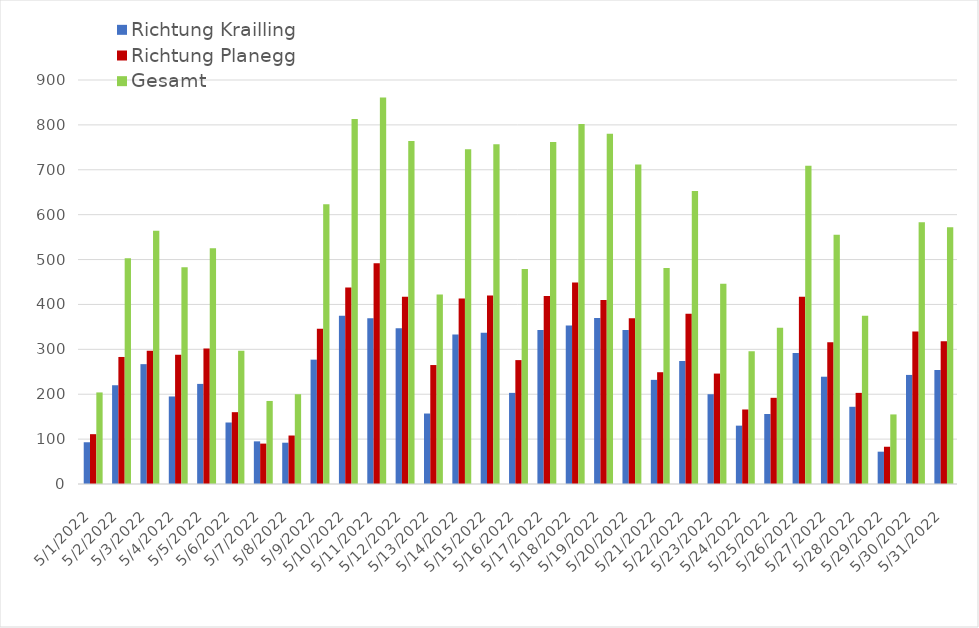
| Category | Richtung Krailling | Richtung Planegg | Gesamt |
|---|---|---|---|
| 5/1/22 | 93 | 111 | 204 |
| 5/2/22 | 220 | 283 | 503 |
| 5/3/22 | 267 | 297 | 564 |
| 5/4/22 | 195 | 288 | 483 |
| 5/5/22 | 223 | 302 | 525 |
| 5/6/22 | 137 | 160 | 297 |
| 5/7/22 | 95 | 90 | 185 |
| 5/8/22 | 92 | 108 | 200 |
| 5/9/22 | 277 | 346 | 623 |
| 5/10/22 | 375 | 438 | 813 |
| 5/11/22 | 369 | 492 | 861 |
| 5/12/22 | 347 | 417 | 764 |
| 5/13/22 | 157 | 265 | 422 |
| 5/14/22 | 333 | 413 | 746 |
| 5/15/22 | 337 | 420 | 757 |
| 5/16/22 | 203 | 276 | 479 |
| 5/17/22 | 343 | 419 | 762 |
| 5/18/22 | 353 | 449 | 802 |
| 5/19/22 | 370 | 410 | 780 |
| 5/20/22 | 343 | 369 | 712 |
| 5/21/22 | 232 | 249 | 481 |
| 5/22/22 | 274 | 379 | 653 |
| 5/23/22 | 200 | 246 | 446 |
| 5/24/22 | 130 | 166 | 296 |
| 5/25/22 | 156 | 192 | 348 |
| 5/26/22 | 292 | 417 | 709 |
| 5/27/22 | 239 | 316 | 555 |
| 5/28/22 | 172 | 203 | 375 |
| 5/29/22 | 72 | 83 | 155 |
| 5/30/22 | 243 | 340 | 583 |
| 5/31/22 | 254 | 318 | 572 |